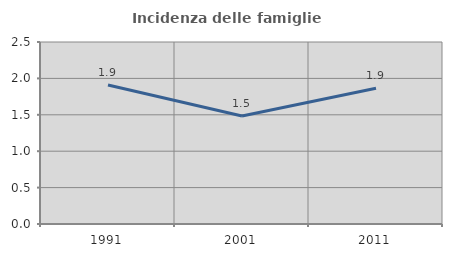
| Category | Incidenza delle famiglie numerose |
|---|---|
| 1991.0 | 1.908 |
| 2001.0 | 1.483 |
| 2011.0 | 1.866 |